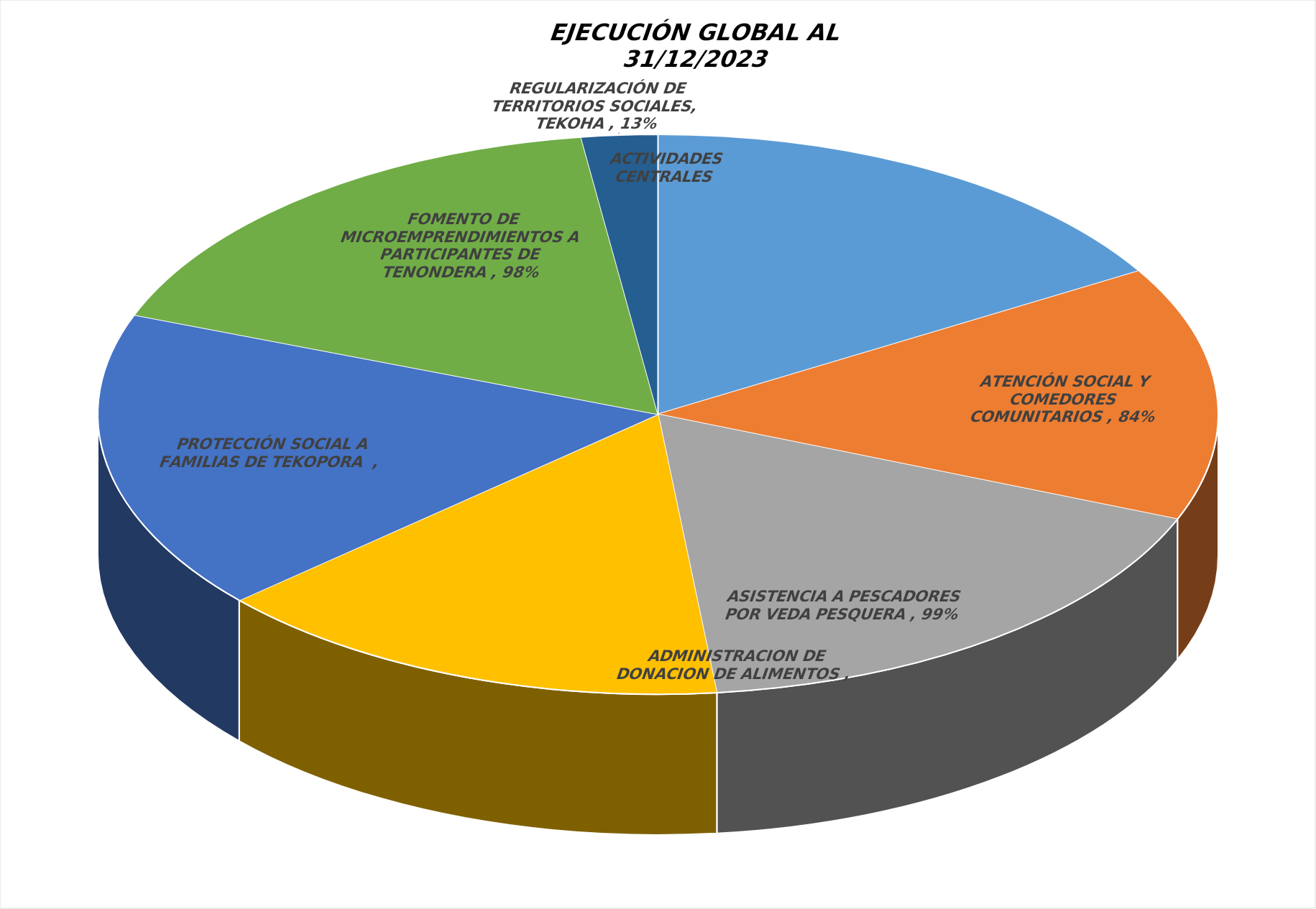
| Category | Series 0 |
|---|---|
| ACTIVIDADES CENTRALES ADMINISTRATIVAS | 0.942 |
| ATENCIÓN SOCIAL Y COMEDORES COMUNITARIOS | 0.841 |
| ASISTENCIA A PESCADORES POR VEDA PESQUERA | 0.987 |
| ADMINISTRACION DE DONACION DE ALIMENTOS | 0.866 |
| PROTECCIÓN SOCIAL A FAMILIAS DE TEKOPORA  | 0.994 |
| FOMENTO DE MICROEMPRENDIMIENTOS A PARTICIPANTES DE TENONDERA | 0.976 |
| REGULARIZACIÓN DE TERRITORIOS SOCIALES, TEKOHA | 0.126 |